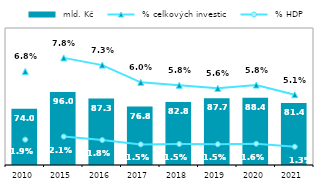
| Category |  mld. Kč |
|---|---|
| 2010.0 | 74.018 |
| 2015.0 | 95.977 |
| 2016.0 | 87.256 |
| 2017.0 | 76.809 |
| 2018.0 | 82.84 |
| 2019.0 | 87.703 |
| 2020.0 | 88.434 |
| 2021.0 | 81.399 |